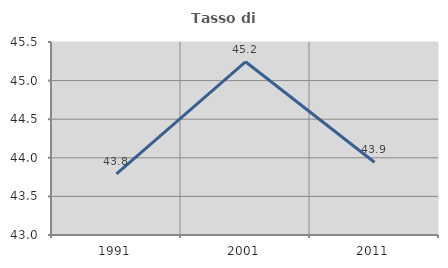
| Category | Tasso di occupazione   |
|---|---|
| 1991.0 | 43.791 |
| 2001.0 | 45.244 |
| 2011.0 | 43.943 |